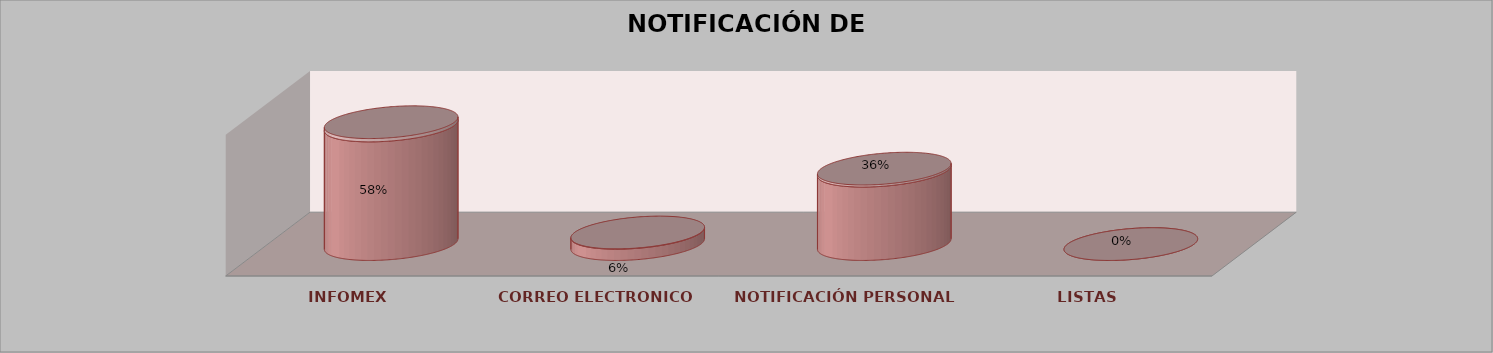
| Category | Series 0 | Series 1 | Series 2 | Series 3 | Series 4 |
|---|---|---|---|---|---|
| INFOMEX |  |  |  | 21 | 0.583 |
| CORREO ELECTRONICO |  |  |  | 2 | 0.056 |
| NOTIFICACIÓN PERSONAL |  |  |  | 13 | 0.361 |
| LISTAS |  |  |  | 0 | 0 |